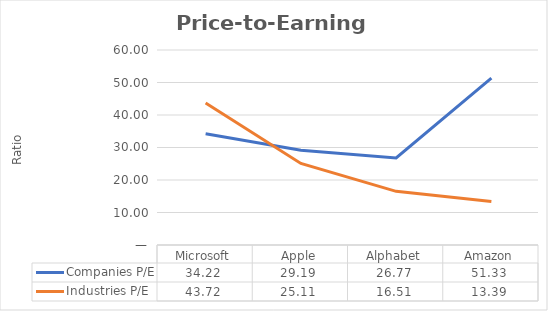
| Category | Companies P/E | Industries P/E |
|---|---|---|
| Microsoft | 34.225 | 43.72 |
| Apple | 29.185 | 25.11 |
| Alphabet | 26.774 | 16.51 |
| Amazon | 51.333 | 13.39 |